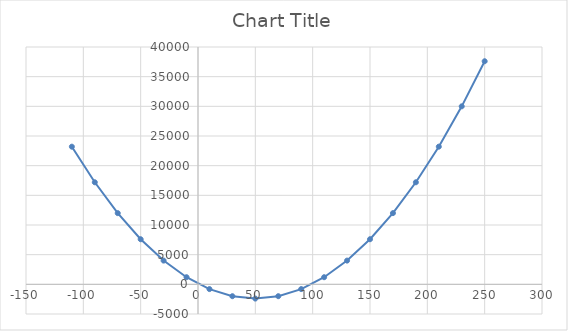
| Category | Series 0 |
|---|---|
| -110.0 | 23200 |
| -90.0 | 17200 |
| -70.0 | 12000 |
| -50.0 | 7600 |
| -30.0 | 4000 |
| -10.0 | 1200 |
| 10.0 | -800 |
| 30.0 | -2000 |
| 50.0 | -2400 |
| 70.0 | -2000 |
| 90.0 | -800 |
| 110.0 | 1200 |
| 130.0 | 4000 |
| 150.0 | 7600 |
| 170.0 | 12000 |
| 190.0 | 17200 |
| 210.0 | 23200 |
| 230.0 | 30000 |
| 250.0 | 37600 |